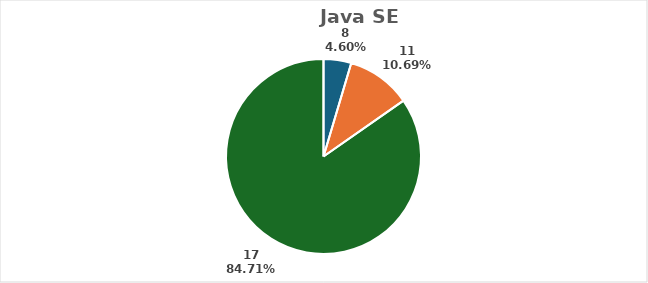
| Category | 8 |
|---|---|
| 8.0 | 0.046 |
| 11.0 | 0.107 |
| 17.0 | 0.847 |